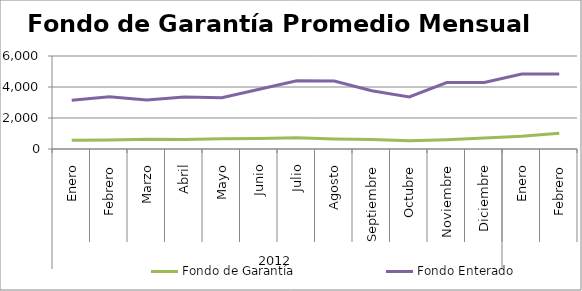
| Category | Fondo de Garantía | Fondo Enterado |
|---|---|---|
| 0 | 560.173 | 3141.641 |
| 1 | 575.916 | 3362.648 |
| 2 | 622.075 | 3154.118 |
| 3 | 612.299 | 3348.058 |
| 4 | 654.277 | 3308.859 |
| 5 | 675.965 | 3850.375 |
| 6 | 729.97 | 4400.539 |
| 7 | 649.095 | 4383.327 |
| 8 | 606.03 | 3757.632 |
| 9 | 525.314 | 3362.932 |
| 10 | 591.646 | 4285.609 |
| 11 | 703.403 | 4296.87 |
| 12 | 823.344 | 4842.786 |
| 13 | 1008.855 | 4845.136 |